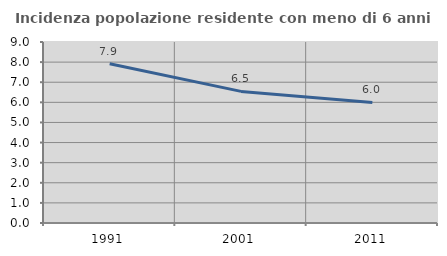
| Category | Incidenza popolazione residente con meno di 6 anni |
|---|---|
| 1991.0 | 7.919 |
| 2001.0 | 6.544 |
| 2011.0 | 5.992 |